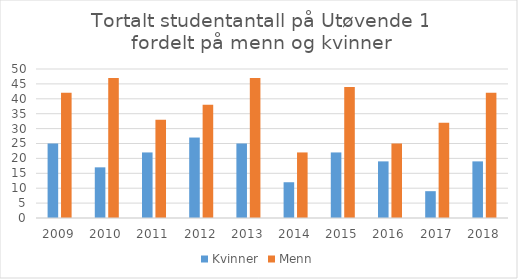
| Category | Kvinner | Menn |
|---|---|---|
| 2009.0 | 25 | 42 |
| 2010.0 | 17 | 47 |
| 2011.0 | 22 | 33 |
| 2012.0 | 27 | 38 |
| 2013.0 | 25 | 47 |
| 2014.0 | 12 | 22 |
| 2015.0 | 22 | 44 |
| 2016.0 | 19 | 25 |
| 2017.0 | 9 | 32 |
| 2018.0 | 19 | 42 |